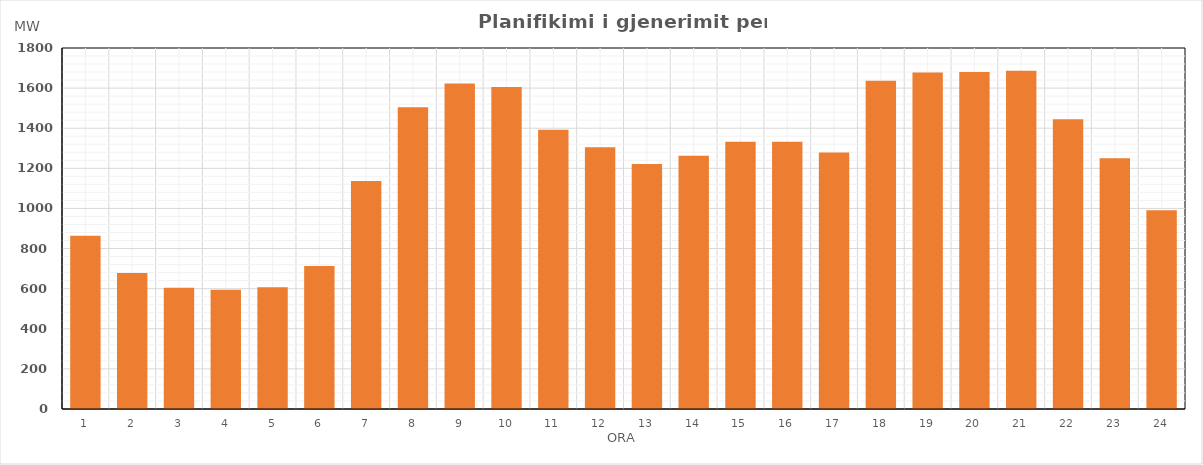
| Category | Max (MW) |
|---|---|
| 0 | 863.339 |
| 1 | 677.566 |
| 2 | 604.557 |
| 3 | 594.413 |
| 4 | 607.581 |
| 5 | 712.742 |
| 6 | 1136.462 |
| 7 | 1504.94 |
| 8 | 1623.358 |
| 9 | 1605.678 |
| 10 | 1391.867 |
| 11 | 1305.673 |
| 12 | 1221.261 |
| 13 | 1262.748 |
| 14 | 1332.277 |
| 15 | 1332.314 |
| 16 | 1278.62 |
| 17 | 1636.479 |
| 18 | 1677.637 |
| 19 | 1680.919 |
| 20 | 1686.902 |
| 21 | 1445.356 |
| 22 | 1249.888 |
| 23 | 990.761 |